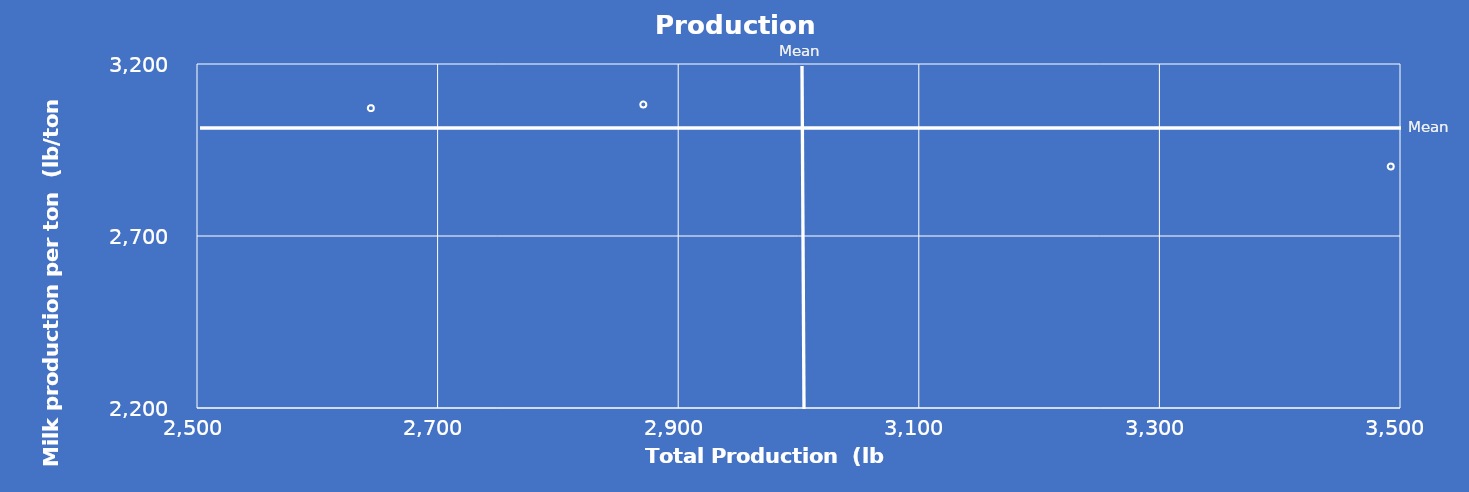
| Category | Series 0 |
|---|---|
| 2871.0 | 3082.333 |
| 2644.486624848 | 3071.667 |
| 3492.302059621 | 2902 |